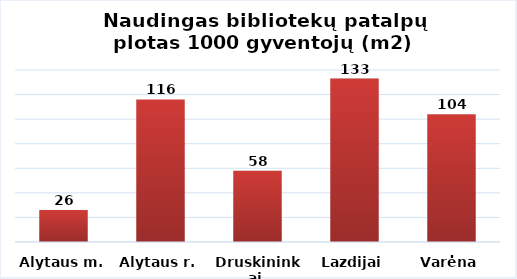
| Category | Series 0 |
|---|---|
| Alytaus m. | 26 |
| Alytaus r. | 116 |
| Druskininkai  | 58 |
| Lazdijai | 133 |
| Varėna | 104 |